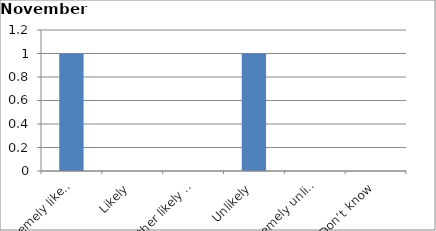
| Category | Series 0 |
|---|---|
| Extremely likely | 1 |
| Likely | 0 |
| Neither likely nor unlikely | 0 |
| Unlikely | 1 |
| Extremely unlikely | 0 |
| Don’t know | 0 |